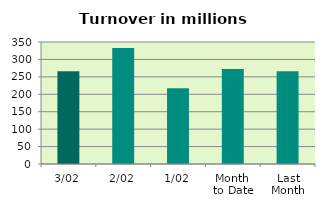
| Category | Series 0 |
|---|---|
| 3/02 | 266.414 |
| 2/02 | 332.797 |
| 1/02 | 217.466 |
| Month 
to Date | 272.226 |
| Last
Month | 265.89 |